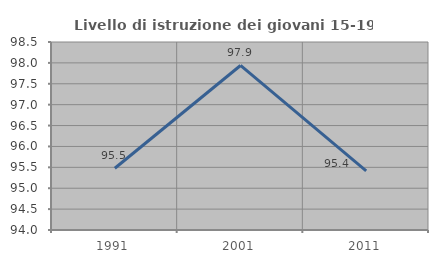
| Category | Livello di istruzione dei giovani 15-19 anni |
|---|---|
| 1991.0 | 95.477 |
| 2001.0 | 97.938 |
| 2011.0 | 95.413 |